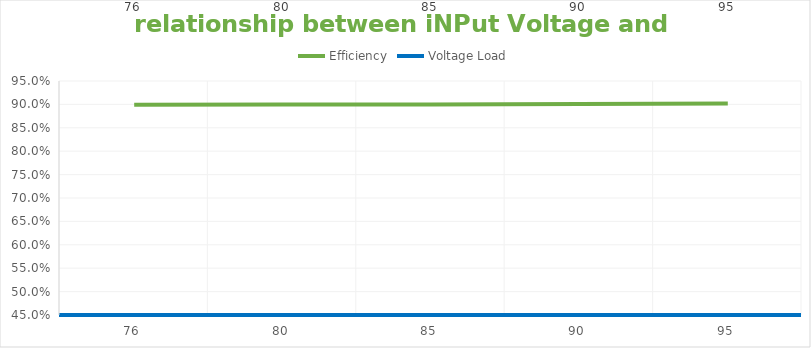
| Category | Efficiency | Voltage Load |
|---|---|---|
| 76.0 | 0.899 | 76 |
| 80.0 | 0.9 | 80 |
| 85.0 | 0.9 | 85 |
| 90.0 | 0.901 | 90 |
| 95.0 | 0.902 | 95 |